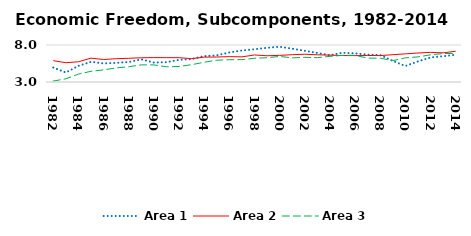
| Category | Area 1 | Area 2 | Area 3 |
|---|---|---|---|
| 1982.0 | 4.951 | 5.888 | 3.127 |
| 1983.0 | 4.28 | 5.604 | 3.435 |
| 1984.0 | 5.178 | 5.735 | 4.068 |
| 1985.0 | 5.733 | 6.223 | 4.445 |
| 1986.0 | 5.509 | 6.038 | 4.641 |
| 1987.0 | 5.585 | 6.146 | 4.902 |
| 1988.0 | 5.706 | 6.2 | 5.067 |
| 1989.0 | 6.062 | 6.279 | 5.316 |
| 1990.0 | 5.632 | 6.297 | 5.309 |
| 1991.0 | 5.674 | 6.292 | 5.058 |
| 1992.0 | 5.997 | 6.286 | 5.095 |
| 1993.0 | 6.107 | 6.152 | 5.341 |
| 1994.0 | 6.495 | 6.359 | 5.665 |
| 1995.0 | 6.603 | 6.374 | 5.947 |
| 1996.0 | 6.991 | 6.429 | 6.015 |
| 1997.0 | 7.257 | 6.399 | 6.022 |
| 1998.0 | 7.425 | 6.651 | 6.209 |
| 1999.0 | 7.623 | 6.547 | 6.278 |
| 2000.0 | 7.766 | 6.601 | 6.457 |
| 2001.0 | 7.496 | 6.689 | 6.264 |
| 2002.0 | 7.227 | 6.754 | 6.332 |
| 2003.0 | 6.922 | 6.675 | 6.292 |
| 2004.0 | 6.617 | 6.631 | 6.465 |
| 2005.0 | 6.949 | 6.574 | 6.599 |
| 2006.0 | 6.868 | 6.565 | 6.606 |
| 2007.0 | 6.691 | 6.583 | 6.226 |
| 2008.0 | 6.641 | 6.571 | 6.22 |
| 2009.0 | 5.846 | 6.691 | 5.887 |
| 2010.0 | 5.162 | 6.804 | 6.264 |
| 2011.0 | 5.783 | 6.917 | 6.394 |
| 2012.0 | 6.314 | 7.007 | 6.675 |
| 2013.0 | 6.481 | 6.941 | 6.845 |
| 2014.0 | 6.685 | 7.153 | 6.859 |